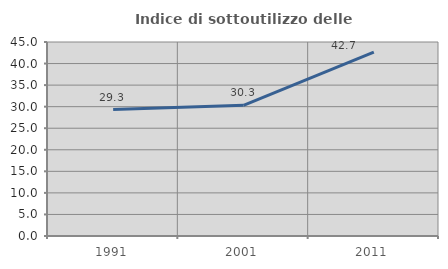
| Category | Indice di sottoutilizzo delle abitazioni  |
|---|---|
| 1991.0 | 29.315 |
| 2001.0 | 30.32 |
| 2011.0 | 42.671 |